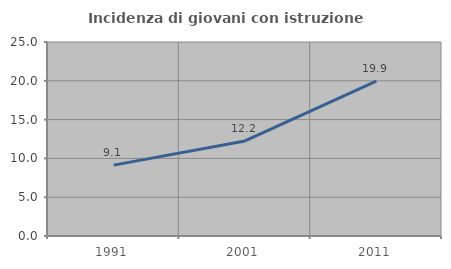
| Category | Incidenza di giovani con istruzione universitaria |
|---|---|
| 1991.0 | 9.134 |
| 2001.0 | 12.245 |
| 2011.0 | 19.947 |